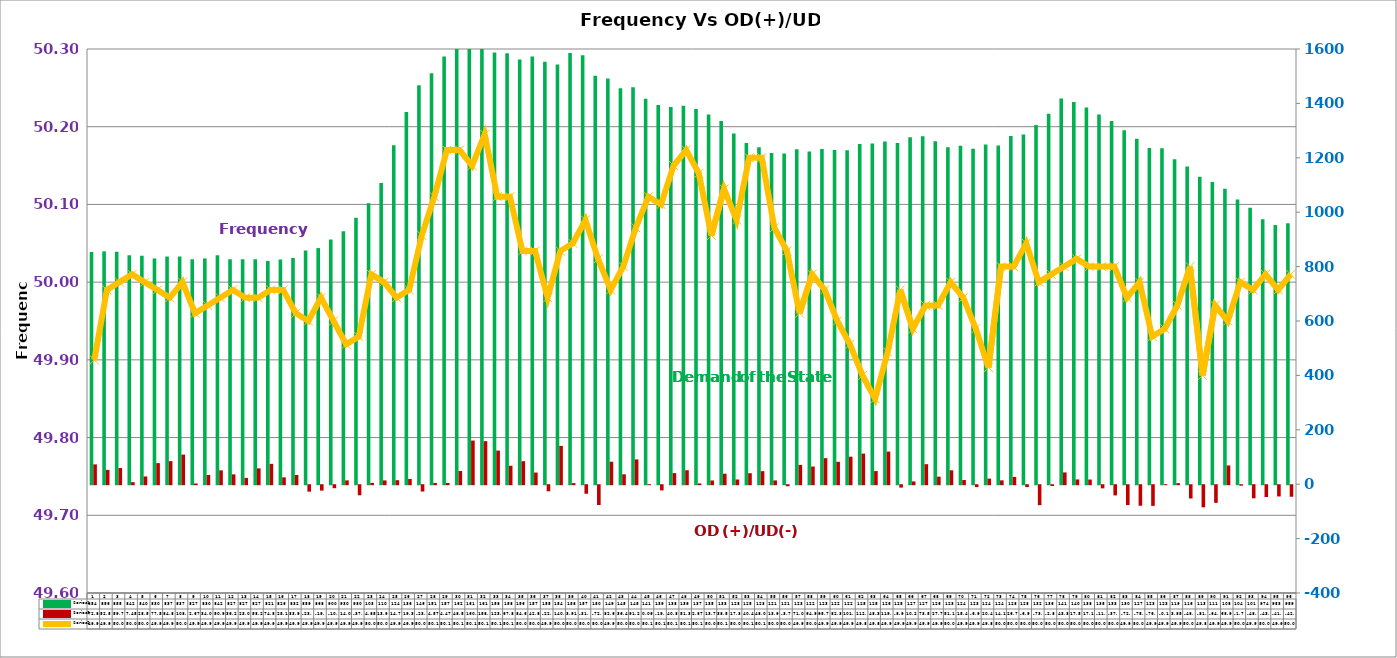
| Category | Series 2 | Series 4 |
|---|---|---|
| 0 | 854 | 72.866 |
| 1 | 856 | 52.576 |
| 2 | 855 | 59.699 |
| 3 | 842 | 7.45 |
| 4 | 840 | 28.554 |
| 5 | 830 | 77.505 |
| 6 | 837 | 84.798 |
| 7 | 837 | 108.858 |
| 8 | 827 | 2.671 |
| 9 | 830 | 34.014 |
| 10 | 842 | 50.947 |
| 11 | 827 | 36.247 |
| 12 | 827 | 23.058 |
| 13 | 827 | 58.295 |
| 14 | 821 | 74.814 |
| 15 | 826 | 25.192 |
| 16 | 832 | 33.963 |
| 17 | 859 | -23.773 |
| 18 | 868 | -19.867 |
| 19 | 900 | -10.967 |
| 20 | 930 | 14.029 |
| 21 | 980 | -37.113 |
| 22 | 1033 | 4.846 |
| 23 | 1107 | 13.976 |
| 24 | 1246 | 14.728 |
| 25 | 1368 | 19.296 |
| 26 | 1467 | -23.302 |
| 27 | 1511 | 4.565 |
| 28 | 1572 | 4.473 |
| 29 | 1621 | 48.573 |
| 30 | 1619 | 160.442 |
| 31 | 1619 | 158.244 |
| 32 | 1587 | 123.507 |
| 33 | 1584 | 67.835 |
| 34 | 1561 | 84.65 |
| 35 | 1572 | 42.803 |
| 36 | 1553 | -22.528 |
| 37 | 1543 | 140.922 |
| 38 | 1585 | 3.912 |
| 39 | 1577 | -31.453 |
| 40 | 1502 | -72.908 |
| 41 | 1492 | 82.654 |
| 42 | 1456 | 36.44 |
| 43 | 1459 | 91.232 |
| 44 | 1417 | 0.06 |
| 45 | 1394 | -19.047 |
| 46 | 1387 | 40.819 |
| 47 | 1391 | 51.32 |
| 48 | 1379 | 2.87 |
| 49 | 1359 | 13.766 |
| 50 | 1335 | 38.564 |
| 51 | 1289 | 17.346 |
| 52 | 1254 | 40.481 |
| 53 | 1239 | 47.995 |
| 54 | 1218 | 13.955 |
| 55 | 1216 | -3.705 |
| 56 | 1231 | 71.029 |
| 57 | 1223 | 64.994 |
| 58 | 1232 | 95.752 |
| 59 | 1229 | 82.324 |
| 60 | 1228 | 101.178 |
| 61 | 1251 | 112.447 |
| 62 | 1253 | 48.3 |
| 63 | 1260 | 119.963 |
| 64 | 1254 | -8.898 |
| 65 | 1276 | 10.197 |
| 66 | 1279 | 73.556 |
| 67 | 1261 | 27.715 |
| 68 | 1239 | 51.107 |
| 69 | 1244 | 15.412 |
| 70 | 1233 | -6.98 |
| 71 | 1249 | 20.447 |
| 72 | 1245 | 14.193 |
| 73 | 1280 | 26.75 |
| 74 | 1286 | -6.937 |
| 75 | 1321 | -73.337 |
| 76 | 1362 | -2.853 |
| 77 | 1418 | 43.347 |
| 78 | 1405 | 17.51 |
| 79 | 1385 | 17.119 |
| 80 | 1359 | -11.615 |
| 81 | 1335 | -37.503 |
| 82 | 1301 | -72.961 |
| 83 | 1270 | -75.569 |
| 84 | 1236 | -76.001 |
| 85 | 1235 | -0.115 |
| 86 | 1195 | 3.846 |
| 87 | 1168 | -48.826 |
| 88 | 1130 | -81.327 |
| 89 | 1111 | -64.815 |
| 90 | 1086 | 68.983 |
| 91 | 1047 | -1.754 |
| 92 | 1016 | -48.161 |
| 93 | 974 | -43.31 |
| 94 | 953 | -41.414 |
| 95 | 959 | -42.501 |